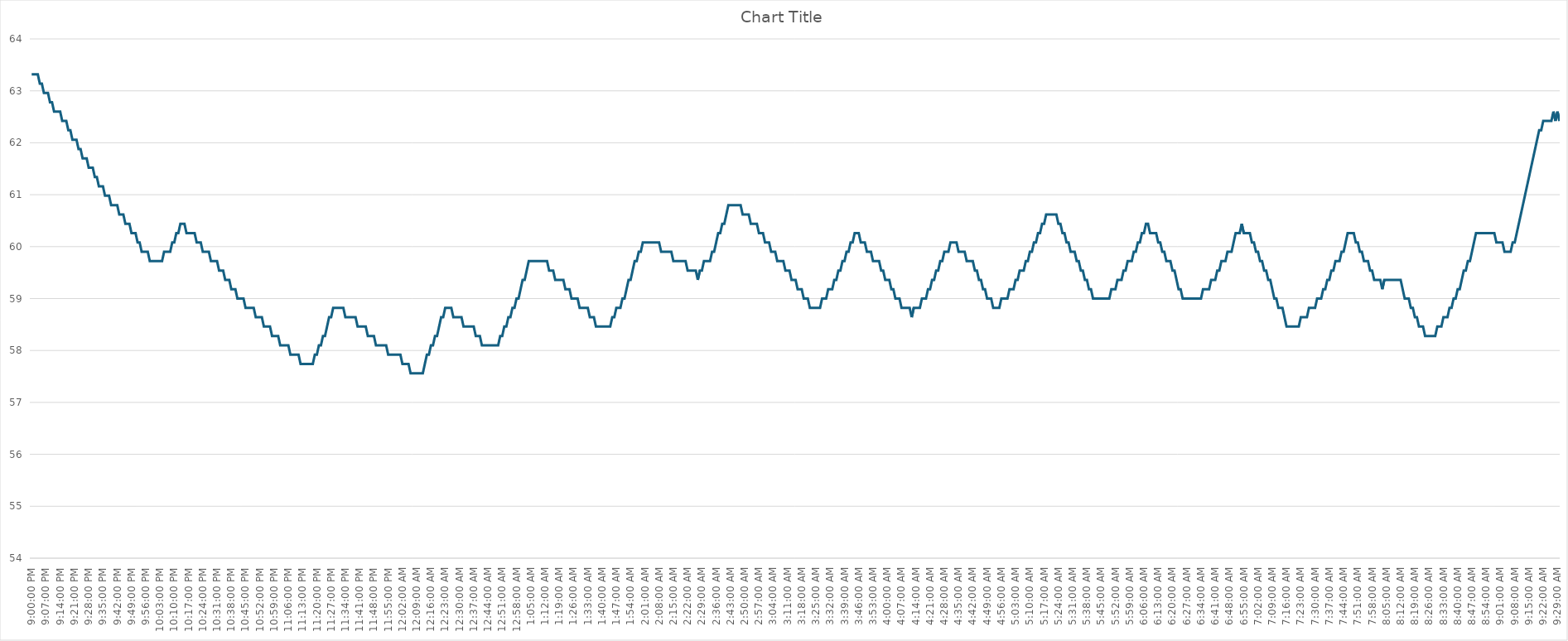
| Category | Series 0 |
|---|---|
| 2024-03-15 21:00:00 | 63.32 |
| 2024-03-15 21:01:00 | 63.32 |
| 2024-03-15 21:02:00 | 63.32 |
| 2024-03-15 21:03:00 | 63.32 |
| 2024-03-15 21:04:00 | 63.14 |
| 2024-03-15 21:05:00 | 63.14 |
| 2024-03-15 21:06:00 | 62.96 |
| 2024-03-15 21:07:00 | 62.96 |
| 2024-03-15 21:08:00 | 62.96 |
| 2024-03-15 21:09:00 | 62.78 |
| 2024-03-15 21:10:00 | 62.78 |
| 2024-03-15 21:11:00 | 62.6 |
| 2024-03-15 21:12:00 | 62.6 |
| 2024-03-15 21:13:00 | 62.6 |
| 2024-03-15 21:14:00 | 62.6 |
| 2024-03-15 21:15:00 | 62.42 |
| 2024-03-15 21:16:00 | 62.42 |
| 2024-03-15 21:17:00 | 62.42 |
| 2024-03-15 21:18:00 | 62.24 |
| 2024-03-15 21:19:00 | 62.24 |
| 2024-03-15 21:20:00 | 62.06 |
| 2024-03-15 21:21:00 | 62.06 |
| 2024-03-15 21:22:00 | 62.06 |
| 2024-03-15 21:23:00 | 61.88 |
| 2024-03-15 21:24:00 | 61.88 |
| 2024-03-15 21:25:00 | 61.7 |
| 2024-03-15 21:26:00 | 61.7 |
| 2024-03-15 21:27:00 | 61.7 |
| 2024-03-15 21:28:00 | 61.52 |
| 2024-03-15 21:29:00 | 61.52 |
| 2024-03-15 21:30:00 | 61.52 |
| 2024-03-15 21:31:00 | 61.34 |
| 2024-03-15 21:32:00 | 61.34 |
| 2024-03-15 21:33:00 | 61.16 |
| 2024-03-15 21:34:00 | 61.16 |
| 2024-03-15 21:35:00 | 61.16 |
| 2024-03-15 21:36:00 | 60.98 |
| 2024-03-15 21:37:00 | 60.98 |
| 2024-03-15 21:38:00 | 60.98 |
| 2024-03-15 21:39:00 | 60.8 |
| 2024-03-15 21:40:00 | 60.8 |
| 2024-03-15 21:41:00 | 60.8 |
| 2024-03-15 21:42:00 | 60.8 |
| 2024-03-15 21:43:00 | 60.62 |
| 2024-03-15 21:44:00 | 60.62 |
| 2024-03-15 21:45:00 | 60.62 |
| 2024-03-15 21:46:00 | 60.44 |
| 2024-03-15 21:47:00 | 60.44 |
| 2024-03-15 21:48:00 | 60.44 |
| 2024-03-15 21:49:00 | 60.26 |
| 2024-03-15 21:50:00 | 60.26 |
| 2024-03-15 21:51:00 | 60.26 |
| 2024-03-15 21:52:00 | 60.08 |
| 2024-03-15 21:53:00 | 60.08 |
| 2024-03-15 21:54:00 | 59.9 |
| 2024-03-15 21:55:00 | 59.9 |
| 2024-03-15 21:56:00 | 59.9 |
| 2024-03-15 21:57:00 | 59.9 |
| 2024-03-15 21:58:00 | 59.72 |
| 2024-03-15 21:59:00 | 59.72 |
| 2024-03-15 22:00:00 | 59.72 |
| 2024-03-15 22:01:00 | 59.72 |
| 2024-03-15 22:02:00 | 59.72 |
| 2024-03-15 22:03:00 | 59.72 |
| 2024-03-15 22:04:00 | 59.72 |
| 2024-03-15 22:05:00 | 59.9 |
| 2024-03-15 22:06:00 | 59.9 |
| 2024-03-15 22:07:00 | 59.9 |
| 2024-03-15 22:08:00 | 59.9 |
| 2024-03-15 22:09:00 | 60.08 |
| 2024-03-15 22:10:00 | 60.08 |
| 2024-03-15 22:11:00 | 60.26 |
| 2024-03-15 22:12:00 | 60.26 |
| 2024-03-15 22:13:00 | 60.44 |
| 2024-03-15 22:14:00 | 60.44 |
| 2024-03-15 22:15:00 | 60.44 |
| 2024-03-15 22:16:00 | 60.26 |
| 2024-03-15 22:17:00 | 60.26 |
| 2024-03-15 22:18:00 | 60.26 |
| 2024-03-15 22:19:00 | 60.26 |
| 2024-03-15 22:20:00 | 60.26 |
| 2024-03-15 22:21:00 | 60.08 |
| 2024-03-15 22:22:00 | 60.08 |
| 2024-03-15 22:23:00 | 60.08 |
| 2024-03-15 22:24:00 | 59.9 |
| 2024-03-15 22:25:00 | 59.9 |
| 2024-03-15 22:26:00 | 59.9 |
| 2024-03-15 22:27:00 | 59.9 |
| 2024-03-15 22:28:00 | 59.72 |
| 2024-03-15 22:29:00 | 59.72 |
| 2024-03-15 22:30:00 | 59.72 |
| 2024-03-15 22:31:00 | 59.72 |
| 2024-03-15 22:32:00 | 59.54 |
| 2024-03-15 22:33:00 | 59.54 |
| 2024-03-15 22:34:00 | 59.54 |
| 2024-03-15 22:35:00 | 59.36 |
| 2024-03-15 22:36:00 | 59.36 |
| 2024-03-15 22:37:00 | 59.36 |
| 2024-03-15 22:38:00 | 59.18 |
| 2024-03-15 22:39:00 | 59.18 |
| 2024-03-15 22:40:00 | 59.18 |
| 2024-03-15 22:41:00 | 59 |
| 2024-03-15 22:42:00 | 59 |
| 2024-03-15 22:43:00 | 59 |
| 2024-03-15 22:44:00 | 59 |
| 2024-03-15 22:45:00 | 58.82 |
| 2024-03-15 22:46:00 | 58.82 |
| 2024-03-15 22:47:00 | 58.82 |
| 2024-03-15 22:48:00 | 58.82 |
| 2024-03-15 22:49:00 | 58.82 |
| 2024-03-15 22:50:00 | 58.64 |
| 2024-03-15 22:51:00 | 58.64 |
| 2024-03-15 22:52:00 | 58.64 |
| 2024-03-15 22:53:00 | 58.64 |
| 2024-03-15 22:54:00 | 58.46 |
| 2024-03-15 22:55:00 | 58.46 |
| 2024-03-15 22:56:00 | 58.46 |
| 2024-03-15 22:57:00 | 58.46 |
| 2024-03-15 22:58:00 | 58.28 |
| 2024-03-15 22:59:00 | 58.28 |
| 2024-03-15 23:00:00 | 58.28 |
| 2024-03-15 23:01:00 | 58.28 |
| 2024-03-15 23:02:00 | 58.1 |
| 2024-03-15 23:03:00 | 58.1 |
| 2024-03-15 23:04:00 | 58.1 |
| 2024-03-15 23:05:00 | 58.1 |
| 2024-03-15 23:06:00 | 58.1 |
| 2024-03-15 23:07:00 | 57.92 |
| 2024-03-15 23:08:00 | 57.92 |
| 2024-03-15 23:09:00 | 57.92 |
| 2024-03-15 23:10:00 | 57.92 |
| 2024-03-15 23:11:00 | 57.92 |
| 2024-03-15 23:12:00 | 57.74 |
| 2024-03-15 23:13:00 | 57.74 |
| 2024-03-15 23:14:00 | 57.74 |
| 2024-03-15 23:15:00 | 57.74 |
| 2024-03-15 23:16:00 | 57.74 |
| 2024-03-15 23:17:00 | 57.74 |
| 2024-03-15 23:18:00 | 57.74 |
| 2024-03-15 23:19:00 | 57.92 |
| 2024-03-15 23:20:00 | 57.92 |
| 2024-03-15 23:21:00 | 58.1 |
| 2024-03-15 23:22:00 | 58.1 |
| 2024-03-15 23:23:00 | 58.28 |
| 2024-03-15 23:24:00 | 58.28 |
| 2024-03-15 23:25:00 | 58.46 |
| 2024-03-15 23:26:00 | 58.64 |
| 2024-03-15 23:27:00 | 58.64 |
| 2024-03-15 23:28:00 | 58.82 |
| 2024-03-15 23:29:00 | 58.82 |
| 2024-03-15 23:30:00 | 58.82 |
| 2024-03-15 23:31:00 | 58.82 |
| 2024-03-15 23:32:00 | 58.82 |
| 2024-03-15 23:33:00 | 58.82 |
| 2024-03-15 23:34:00 | 58.64 |
| 2024-03-15 23:35:00 | 58.64 |
| 2024-03-15 23:36:00 | 58.64 |
| 2024-03-15 23:37:00 | 58.64 |
| 2024-03-15 23:38:00 | 58.64 |
| 2024-03-15 23:39:00 | 58.64 |
| 2024-03-15 23:40:00 | 58.46 |
| 2024-03-15 23:41:00 | 58.46 |
| 2024-03-15 23:42:00 | 58.46 |
| 2024-03-15 23:43:00 | 58.46 |
| 2024-03-15 23:44:00 | 58.46 |
| 2024-03-15 23:45:00 | 58.28 |
| 2024-03-15 23:46:00 | 58.28 |
| 2024-03-15 23:47:00 | 58.28 |
| 2024-03-15 23:48:00 | 58.28 |
| 2024-03-15 23:49:00 | 58.1 |
| 2024-03-15 23:50:00 | 58.1 |
| 2024-03-15 23:51:00 | 58.1 |
| 2024-03-15 23:52:00 | 58.1 |
| 2024-03-15 23:53:00 | 58.1 |
| 2024-03-15 23:54:00 | 58.1 |
| 2024-03-15 23:55:00 | 57.92 |
| 2024-03-15 23:56:00 | 57.92 |
| 2024-03-15 23:57:00 | 57.92 |
| 2024-03-15 23:58:00 | 57.92 |
| 2024-03-15 23:59:00 | 57.92 |
| 2024-03-16 | 57.92 |
| 2024-03-16 00:01:00 | 57.92 |
| 2024-03-16 00:02:00 | 57.74 |
| 2024-03-16 00:03:00 | 57.74 |
| 2024-03-16 00:04:00 | 57.74 |
| 2024-03-16 00:05:00 | 57.74 |
| 2024-03-16 00:06:00 | 57.56 |
| 2024-03-16 00:07:00 | 57.56 |
| 2024-03-16 00:08:00 | 57.56 |
| 2024-03-16 00:09:00 | 57.56 |
| 2024-03-16 00:10:00 | 57.56 |
| 2024-03-16 00:11:00 | 57.56 |
| 2024-03-16 00:12:00 | 57.56 |
| 2024-03-16 00:13:00 | 57.74 |
| 2024-03-16 00:14:00 | 57.92 |
| 2024-03-16 00:15:00 | 57.92 |
| 2024-03-16 00:16:00 | 58.1 |
| 2024-03-16 00:17:00 | 58.1 |
| 2024-03-16 00:18:00 | 58.28 |
| 2024-03-16 00:19:00 | 58.28 |
| 2024-03-16 00:20:00 | 58.46 |
| 2024-03-16 00:21:00 | 58.64 |
| 2024-03-16 00:22:00 | 58.64 |
| 2024-03-16 00:23:00 | 58.82 |
| 2024-03-16 00:24:00 | 58.82 |
| 2024-03-16 00:25:00 | 58.82 |
| 2024-03-16 00:26:00 | 58.82 |
| 2024-03-16 00:27:00 | 58.64 |
| 2024-03-16 00:28:00 | 58.64 |
| 2024-03-16 00:29:00 | 58.64 |
| 2024-03-16 00:30:00 | 58.64 |
| 2024-03-16 00:31:00 | 58.64 |
| 2024-03-16 00:32:00 | 58.46 |
| 2024-03-16 00:33:00 | 58.46 |
| 2024-03-16 00:34:00 | 58.46 |
| 2024-03-16 00:35:00 | 58.46 |
| 2024-03-16 00:36:00 | 58.46 |
| 2024-03-16 00:37:00 | 58.46 |
| 2024-03-16 00:38:00 | 58.28 |
| 2024-03-16 00:39:00 | 58.28 |
| 2024-03-16 00:40:00 | 58.28 |
| 2024-03-16 00:41:00 | 58.1 |
| 2024-03-16 00:42:00 | 58.1 |
| 2024-03-16 00:43:00 | 58.1 |
| 2024-03-16 00:44:00 | 58.1 |
| 2024-03-16 00:45:00 | 58.1 |
| 2024-03-16 00:46:00 | 58.1 |
| 2024-03-16 00:47:00 | 58.1 |
| 2024-03-16 00:48:00 | 58.1 |
| 2024-03-16 00:49:00 | 58.1 |
| 2024-03-16 00:50:00 | 58.28 |
| 2024-03-16 00:51:00 | 58.28 |
| 2024-03-16 00:52:00 | 58.46 |
| 2024-03-16 00:53:00 | 58.46 |
| 2024-03-16 00:54:00 | 58.64 |
| 2024-03-16 00:55:00 | 58.64 |
| 2024-03-16 00:56:00 | 58.82 |
| 2024-03-16 00:57:00 | 58.82 |
| 2024-03-16 00:58:00 | 59 |
| 2024-03-16 00:59:00 | 59 |
| 2024-03-16 01:00:00 | 59.18 |
| 2024-03-16 01:01:00 | 59.36 |
| 2024-03-16 01:02:00 | 59.36 |
| 2024-03-16 01:03:00 | 59.54 |
| 2024-03-16 01:04:00 | 59.72 |
| 2024-03-16 01:05:00 | 59.72 |
| 2024-03-16 01:06:00 | 59.72 |
| 2024-03-16 01:07:00 | 59.72 |
| 2024-03-16 01:08:00 | 59.72 |
| 2024-03-16 01:09:00 | 59.72 |
| 2024-03-16 01:10:00 | 59.72 |
| 2024-03-16 01:11:00 | 59.72 |
| 2024-03-16 01:12:00 | 59.72 |
| 2024-03-16 01:13:00 | 59.72 |
| 2024-03-16 01:14:00 | 59.54 |
| 2024-03-16 01:15:00 | 59.54 |
| 2024-03-16 01:16:00 | 59.54 |
| 2024-03-16 01:17:00 | 59.36 |
| 2024-03-16 01:18:00 | 59.36 |
| 2024-03-16 01:19:00 | 59.36 |
| 2024-03-16 01:20:00 | 59.36 |
| 2024-03-16 01:21:00 | 59.36 |
| 2024-03-16 01:22:00 | 59.18 |
| 2024-03-16 01:23:00 | 59.18 |
| 2024-03-16 01:24:00 | 59.18 |
| 2024-03-16 01:25:00 | 59 |
| 2024-03-16 01:26:00 | 59 |
| 2024-03-16 01:27:00 | 59 |
| 2024-03-16 01:28:00 | 59 |
| 2024-03-16 01:29:00 | 58.82 |
| 2024-03-16 01:30:00 | 58.82 |
| 2024-03-16 01:31:00 | 58.82 |
| 2024-03-16 01:32:00 | 58.82 |
| 2024-03-16 01:33:00 | 58.82 |
| 2024-03-16 01:34:00 | 58.64 |
| 2024-03-16 01:35:00 | 58.64 |
| 2024-03-16 01:36:00 | 58.64 |
| 2024-03-16 01:37:00 | 58.46 |
| 2024-03-16 01:38:00 | 58.46 |
| 2024-03-16 01:39:00 | 58.46 |
| 2024-03-16 01:40:00 | 58.46 |
| 2024-03-16 01:41:00 | 58.46 |
| 2024-03-16 01:42:00 | 58.46 |
| 2024-03-16 01:43:00 | 58.46 |
| 2024-03-16 01:44:00 | 58.46 |
| 2024-03-16 01:45:00 | 58.64 |
| 2024-03-16 01:46:00 | 58.64 |
| 2024-03-16 01:47:00 | 58.82 |
| 2024-03-16 01:48:00 | 58.82 |
| 2024-03-16 01:49:00 | 58.82 |
| 2024-03-16 01:50:00 | 59 |
| 2024-03-16 01:51:00 | 59 |
| 2024-03-16 01:52:00 | 59.18 |
| 2024-03-16 01:53:00 | 59.36 |
| 2024-03-16 01:54:00 | 59.36 |
| 2024-03-16 01:55:00 | 59.54 |
| 2024-03-16 01:56:00 | 59.72 |
| 2024-03-16 01:57:00 | 59.72 |
| 2024-03-16 01:58:00 | 59.9 |
| 2024-03-16 01:59:00 | 59.9 |
| 2024-03-16 02:00:00 | 60.08 |
| 2024-03-16 02:01:00 | 60.08 |
| 2024-03-16 02:02:00 | 60.08 |
| 2024-03-16 02:03:00 | 60.08 |
| 2024-03-16 02:04:00 | 60.08 |
| 2024-03-16 02:05:00 | 60.08 |
| 2024-03-16 02:06:00 | 60.08 |
| 2024-03-16 02:07:00 | 60.08 |
| 2024-03-16 02:08:00 | 60.08 |
| 2024-03-16 02:09:00 | 59.9 |
| 2024-03-16 02:10:00 | 59.9 |
| 2024-03-16 02:11:00 | 59.9 |
| 2024-03-16 02:12:00 | 59.9 |
| 2024-03-16 02:13:00 | 59.9 |
| 2024-03-16 02:14:00 | 59.9 |
| 2024-03-16 02:15:00 | 59.72 |
| 2024-03-16 02:16:00 | 59.72 |
| 2024-03-16 02:17:00 | 59.72 |
| 2024-03-16 02:18:00 | 59.72 |
| 2024-03-16 02:19:00 | 59.72 |
| 2024-03-16 02:20:00 | 59.72 |
| 2024-03-16 02:21:00 | 59.72 |
| 2024-03-16 02:22:00 | 59.54 |
| 2024-03-16 02:23:00 | 59.54 |
| 2024-03-16 02:24:00 | 59.54 |
| 2024-03-16 02:25:00 | 59.54 |
| 2024-03-16 02:26:00 | 59.54 |
| 2024-03-16 02:27:00 | 59.36 |
| 2024-03-16 02:28:00 | 59.54 |
| 2024-03-16 02:29:00 | 59.54 |
| 2024-03-16 02:30:00 | 59.72 |
| 2024-03-16 02:31:00 | 59.72 |
| 2024-03-16 02:32:00 | 59.72 |
| 2024-03-16 02:33:00 | 59.72 |
| 2024-03-16 02:34:00 | 59.9 |
| 2024-03-16 02:35:00 | 59.9 |
| 2024-03-16 02:36:00 | 60.08 |
| 2024-03-16 02:37:00 | 60.26 |
| 2024-03-16 02:38:00 | 60.26 |
| 2024-03-16 02:39:00 | 60.44 |
| 2024-03-16 02:40:00 | 60.44 |
| 2024-03-16 02:41:00 | 60.62 |
| 2024-03-16 02:42:00 | 60.8 |
| 2024-03-16 02:43:00 | 60.8 |
| 2024-03-16 02:44:00 | 60.8 |
| 2024-03-16 02:45:00 | 60.8 |
| 2024-03-16 02:46:00 | 60.8 |
| 2024-03-16 02:47:00 | 60.8 |
| 2024-03-16 02:48:00 | 60.8 |
| 2024-03-16 02:49:00 | 60.62 |
| 2024-03-16 02:50:00 | 60.62 |
| 2024-03-16 02:51:00 | 60.62 |
| 2024-03-16 02:52:00 | 60.62 |
| 2024-03-16 02:53:00 | 60.44 |
| 2024-03-16 02:54:00 | 60.44 |
| 2024-03-16 02:55:00 | 60.44 |
| 2024-03-16 02:56:00 | 60.44 |
| 2024-03-16 02:57:00 | 60.26 |
| 2024-03-16 02:58:00 | 60.26 |
| 2024-03-16 02:59:00 | 60.26 |
| 2024-03-16 03:00:00 | 60.08 |
| 2024-03-16 03:01:00 | 60.08 |
| 2024-03-16 03:02:00 | 60.08 |
| 2024-03-16 03:03:00 | 59.9 |
| 2024-03-16 03:04:00 | 59.9 |
| 2024-03-16 03:05:00 | 59.9 |
| 2024-03-16 03:06:00 | 59.72 |
| 2024-03-16 03:07:00 | 59.72 |
| 2024-03-16 03:08:00 | 59.72 |
| 2024-03-16 03:09:00 | 59.72 |
| 2024-03-16 03:10:00 | 59.54 |
| 2024-03-16 03:11:00 | 59.54 |
| 2024-03-16 03:12:00 | 59.54 |
| 2024-03-16 03:13:00 | 59.36 |
| 2024-03-16 03:14:00 | 59.36 |
| 2024-03-16 03:15:00 | 59.36 |
| 2024-03-16 03:16:00 | 59.18 |
| 2024-03-16 03:17:00 | 59.18 |
| 2024-03-16 03:18:00 | 59.18 |
| 2024-03-16 03:19:00 | 59 |
| 2024-03-16 03:20:00 | 59 |
| 2024-03-16 03:21:00 | 59 |
| 2024-03-16 03:22:00 | 58.82 |
| 2024-03-16 03:23:00 | 58.82 |
| 2024-03-16 03:24:00 | 58.82 |
| 2024-03-16 03:25:00 | 58.82 |
| 2024-03-16 03:26:00 | 58.82 |
| 2024-03-16 03:27:00 | 58.82 |
| 2024-03-16 03:28:00 | 59 |
| 2024-03-16 03:29:00 | 59 |
| 2024-03-16 03:30:00 | 59 |
| 2024-03-16 03:31:00 | 59.18 |
| 2024-03-16 03:32:00 | 59.18 |
| 2024-03-16 03:33:00 | 59.18 |
| 2024-03-16 03:34:00 | 59.36 |
| 2024-03-16 03:35:00 | 59.36 |
| 2024-03-16 03:36:00 | 59.54 |
| 2024-03-16 03:37:00 | 59.54 |
| 2024-03-16 03:38:00 | 59.72 |
| 2024-03-16 03:39:00 | 59.72 |
| 2024-03-16 03:40:00 | 59.9 |
| 2024-03-16 03:41:00 | 59.9 |
| 2024-03-16 03:42:00 | 60.08 |
| 2024-03-16 03:43:00 | 60.08 |
| 2024-03-16 03:44:00 | 60.26 |
| 2024-03-16 03:45:00 | 60.26 |
| 2024-03-16 03:46:00 | 60.26 |
| 2024-03-16 03:47:00 | 60.08 |
| 2024-03-16 03:48:00 | 60.08 |
| 2024-03-16 03:49:00 | 60.08 |
| 2024-03-16 03:50:00 | 59.9 |
| 2024-03-16 03:51:00 | 59.9 |
| 2024-03-16 03:52:00 | 59.9 |
| 2024-03-16 03:53:00 | 59.72 |
| 2024-03-16 03:54:00 | 59.72 |
| 2024-03-16 03:55:00 | 59.72 |
| 2024-03-16 03:56:00 | 59.72 |
| 2024-03-16 03:57:00 | 59.54 |
| 2024-03-16 03:58:00 | 59.54 |
| 2024-03-16 03:59:00 | 59.36 |
| 2024-03-16 04:00:00 | 59.36 |
| 2024-03-16 04:01:00 | 59.36 |
| 2024-03-16 04:02:00 | 59.18 |
| 2024-03-16 04:03:00 | 59.18 |
| 2024-03-16 04:04:00 | 59 |
| 2024-03-16 04:05:00 | 59 |
| 2024-03-16 04:06:00 | 59 |
| 2024-03-16 04:07:00 | 58.82 |
| 2024-03-16 04:08:00 | 58.82 |
| 2024-03-16 04:09:00 | 58.82 |
| 2024-03-16 04:10:00 | 58.82 |
| 2024-03-16 04:11:00 | 58.82 |
| 2024-03-16 04:12:00 | 58.64 |
| 2024-03-16 04:13:00 | 58.82 |
| 2024-03-16 04:14:00 | 58.82 |
| 2024-03-16 04:15:00 | 58.82 |
| 2024-03-16 04:16:00 | 58.82 |
| 2024-03-16 04:17:00 | 59 |
| 2024-03-16 04:18:00 | 59 |
| 2024-03-16 04:19:00 | 59 |
| 2024-03-16 04:20:00 | 59.18 |
| 2024-03-16 04:21:00 | 59.18 |
| 2024-03-16 04:22:00 | 59.36 |
| 2024-03-16 04:23:00 | 59.36 |
| 2024-03-16 04:24:00 | 59.54 |
| 2024-03-16 04:25:00 | 59.54 |
| 2024-03-16 04:26:00 | 59.72 |
| 2024-03-16 04:27:00 | 59.72 |
| 2024-03-16 04:28:00 | 59.9 |
| 2024-03-16 04:29:00 | 59.9 |
| 2024-03-16 04:30:00 | 59.9 |
| 2024-03-16 04:31:00 | 60.08 |
| 2024-03-16 04:32:00 | 60.08 |
| 2024-03-16 04:33:00 | 60.08 |
| 2024-03-16 04:34:00 | 60.08 |
| 2024-03-16 04:35:00 | 59.9 |
| 2024-03-16 04:36:00 | 59.9 |
| 2024-03-16 04:37:00 | 59.9 |
| 2024-03-16 04:38:00 | 59.9 |
| 2024-03-16 04:39:00 | 59.72 |
| 2024-03-16 04:40:00 | 59.72 |
| 2024-03-16 04:41:00 | 59.72 |
| 2024-03-16 04:42:00 | 59.72 |
| 2024-03-16 04:43:00 | 59.54 |
| 2024-03-16 04:44:00 | 59.54 |
| 2024-03-16 04:45:00 | 59.36 |
| 2024-03-16 04:46:00 | 59.36 |
| 2024-03-16 04:47:00 | 59.18 |
| 2024-03-16 04:48:00 | 59.18 |
| 2024-03-16 04:49:00 | 59 |
| 2024-03-16 04:50:00 | 59 |
| 2024-03-16 04:51:00 | 59 |
| 2024-03-16 04:52:00 | 58.82 |
| 2024-03-16 04:53:00 | 58.82 |
| 2024-03-16 04:54:00 | 58.82 |
| 2024-03-16 04:55:00 | 58.82 |
| 2024-03-16 04:56:00 | 59 |
| 2024-03-16 04:57:00 | 59 |
| 2024-03-16 04:58:00 | 59 |
| 2024-03-16 04:59:00 | 59 |
| 2024-03-16 05:00:00 | 59.18 |
| 2024-03-16 05:01:00 | 59.18 |
| 2024-03-16 05:02:00 | 59.18 |
| 2024-03-16 05:03:00 | 59.36 |
| 2024-03-16 05:04:00 | 59.36 |
| 2024-03-16 05:05:00 | 59.54 |
| 2024-03-16 05:06:00 | 59.54 |
| 2024-03-16 05:07:00 | 59.54 |
| 2024-03-16 05:08:00 | 59.72 |
| 2024-03-16 05:09:00 | 59.72 |
| 2024-03-16 05:10:00 | 59.9 |
| 2024-03-16 05:11:00 | 59.9 |
| 2024-03-16 05:12:00 | 60.08 |
| 2024-03-16 05:13:00 | 60.08 |
| 2024-03-16 05:14:00 | 60.26 |
| 2024-03-16 05:15:00 | 60.26 |
| 2024-03-16 05:16:00 | 60.44 |
| 2024-03-16 05:17:00 | 60.44 |
| 2024-03-16 05:18:00 | 60.62 |
| 2024-03-16 05:19:00 | 60.62 |
| 2024-03-16 05:20:00 | 60.62 |
| 2024-03-16 05:21:00 | 60.62 |
| 2024-03-16 05:22:00 | 60.62 |
| 2024-03-16 05:23:00 | 60.62 |
| 2024-03-16 05:24:00 | 60.44 |
| 2024-03-16 05:25:00 | 60.44 |
| 2024-03-16 05:26:00 | 60.26 |
| 2024-03-16 05:27:00 | 60.26 |
| 2024-03-16 05:28:00 | 60.08 |
| 2024-03-16 05:29:00 | 60.08 |
| 2024-03-16 05:30:00 | 59.9 |
| 2024-03-16 05:31:00 | 59.9 |
| 2024-03-16 05:32:00 | 59.9 |
| 2024-03-16 05:33:00 | 59.72 |
| 2024-03-16 05:34:00 | 59.72 |
| 2024-03-16 05:35:00 | 59.54 |
| 2024-03-16 05:36:00 | 59.54 |
| 2024-03-16 05:37:00 | 59.36 |
| 2024-03-16 05:38:00 | 59.36 |
| 2024-03-16 05:39:00 | 59.18 |
| 2024-03-16 05:40:00 | 59.18 |
| 2024-03-16 05:41:00 | 59 |
| 2024-03-16 05:42:00 | 59 |
| 2024-03-16 05:43:00 | 59 |
| 2024-03-16 05:44:00 | 59 |
| 2024-03-16 05:45:00 | 59 |
| 2024-03-16 05:46:00 | 59 |
| 2024-03-16 05:47:00 | 59 |
| 2024-03-16 05:48:00 | 59 |
| 2024-03-16 05:49:00 | 59 |
| 2024-03-16 05:50:00 | 59.18 |
| 2024-03-16 05:51:00 | 59.18 |
| 2024-03-16 05:52:00 | 59.18 |
| 2024-03-16 05:53:00 | 59.36 |
| 2024-03-16 05:54:00 | 59.36 |
| 2024-03-16 05:55:00 | 59.36 |
| 2024-03-16 05:56:00 | 59.54 |
| 2024-03-16 05:57:00 | 59.54 |
| 2024-03-16 05:58:00 | 59.72 |
| 2024-03-16 05:59:00 | 59.72 |
| 2024-03-16 06:00:00 | 59.72 |
| 2024-03-16 06:01:00 | 59.9 |
| 2024-03-16 06:02:00 | 59.9 |
| 2024-03-16 06:03:00 | 60.08 |
| 2024-03-16 06:04:00 | 60.08 |
| 2024-03-16 06:05:00 | 60.26 |
| 2024-03-16 06:06:00 | 60.26 |
| 2024-03-16 06:07:00 | 60.44 |
| 2024-03-16 06:08:00 | 60.44 |
| 2024-03-16 06:09:00 | 60.26 |
| 2024-03-16 06:10:00 | 60.26 |
| 2024-03-16 06:11:00 | 60.26 |
| 2024-03-16 06:12:00 | 60.26 |
| 2024-03-16 06:13:00 | 60.08 |
| 2024-03-16 06:14:00 | 60.08 |
| 2024-03-16 06:15:00 | 59.9 |
| 2024-03-16 06:16:00 | 59.9 |
| 2024-03-16 06:17:00 | 59.72 |
| 2024-03-16 06:18:00 | 59.72 |
| 2024-03-16 06:19:00 | 59.72 |
| 2024-03-16 06:20:00 | 59.54 |
| 2024-03-16 06:21:00 | 59.54 |
| 2024-03-16 06:22:00 | 59.36 |
| 2024-03-16 06:23:00 | 59.18 |
| 2024-03-16 06:24:00 | 59.18 |
| 2024-03-16 06:25:00 | 59 |
| 2024-03-16 06:26:00 | 59 |
| 2024-03-16 06:27:00 | 59 |
| 2024-03-16 06:28:00 | 59 |
| 2024-03-16 06:29:00 | 59 |
| 2024-03-16 06:30:00 | 59 |
| 2024-03-16 06:31:00 | 59 |
| 2024-03-16 06:32:00 | 59 |
| 2024-03-16 06:33:00 | 59 |
| 2024-03-16 06:34:00 | 59 |
| 2024-03-16 06:35:00 | 59.18 |
| 2024-03-16 06:36:00 | 59.18 |
| 2024-03-16 06:37:00 | 59.18 |
| 2024-03-16 06:38:00 | 59.18 |
| 2024-03-16 06:39:00 | 59.36 |
| 2024-03-16 06:40:00 | 59.36 |
| 2024-03-16 06:41:00 | 59.36 |
| 2024-03-16 06:42:00 | 59.54 |
| 2024-03-16 06:43:00 | 59.54 |
| 2024-03-16 06:44:00 | 59.72 |
| 2024-03-16 06:45:00 | 59.72 |
| 2024-03-16 06:46:00 | 59.72 |
| 2024-03-16 06:47:00 | 59.9 |
| 2024-03-16 06:48:00 | 59.9 |
| 2024-03-16 06:49:00 | 59.9 |
| 2024-03-16 06:50:00 | 60.08 |
| 2024-03-16 06:51:00 | 60.26 |
| 2024-03-16 06:52:00 | 60.26 |
| 2024-03-16 06:53:00 | 60.26 |
| 2024-03-16 06:54:00 | 60.44 |
| 2024-03-16 06:55:00 | 60.26 |
| 2024-03-16 06:56:00 | 60.26 |
| 2024-03-16 06:57:00 | 60.26 |
| 2024-03-16 06:58:00 | 60.26 |
| 2024-03-16 06:59:00 | 60.08 |
| 2024-03-16 07:00:00 | 60.08 |
| 2024-03-16 07:01:00 | 59.9 |
| 2024-03-16 07:02:00 | 59.9 |
| 2024-03-16 07:03:00 | 59.72 |
| 2024-03-16 07:04:00 | 59.72 |
| 2024-03-16 07:05:00 | 59.54 |
| 2024-03-16 07:06:00 | 59.54 |
| 2024-03-16 07:07:00 | 59.36 |
| 2024-03-16 07:08:00 | 59.36 |
| 2024-03-16 07:09:00 | 59.18 |
| 2024-03-16 07:10:00 | 59 |
| 2024-03-16 07:11:00 | 59 |
| 2024-03-16 07:12:00 | 58.82 |
| 2024-03-16 07:13:00 | 58.82 |
| 2024-03-16 07:14:00 | 58.82 |
| 2024-03-16 07:15:00 | 58.64 |
| 2024-03-16 07:16:00 | 58.46 |
| 2024-03-16 07:17:00 | 58.46 |
| 2024-03-16 07:18:00 | 58.46 |
| 2024-03-16 07:19:00 | 58.46 |
| 2024-03-16 07:20:00 | 58.46 |
| 2024-03-16 07:21:00 | 58.46 |
| 2024-03-16 07:22:00 | 58.46 |
| 2024-03-16 07:23:00 | 58.64 |
| 2024-03-16 07:24:00 | 58.64 |
| 2024-03-16 07:25:00 | 58.64 |
| 2024-03-16 07:26:00 | 58.64 |
| 2024-03-16 07:27:00 | 58.82 |
| 2024-03-16 07:28:00 | 58.82 |
| 2024-03-16 07:29:00 | 58.82 |
| 2024-03-16 07:30:00 | 58.82 |
| 2024-03-16 07:31:00 | 59 |
| 2024-03-16 07:32:00 | 59 |
| 2024-03-16 07:33:00 | 59 |
| 2024-03-16 07:34:00 | 59.18 |
| 2024-03-16 07:35:00 | 59.18 |
| 2024-03-16 07:36:00 | 59.36 |
| 2024-03-16 07:37:00 | 59.36 |
| 2024-03-16 07:38:00 | 59.54 |
| 2024-03-16 07:39:00 | 59.54 |
| 2024-03-16 07:40:00 | 59.72 |
| 2024-03-16 07:41:00 | 59.72 |
| 2024-03-16 07:42:00 | 59.72 |
| 2024-03-16 07:43:00 | 59.9 |
| 2024-03-16 07:44:00 | 59.9 |
| 2024-03-16 07:45:00 | 60.08 |
| 2024-03-16 07:46:00 | 60.26 |
| 2024-03-16 07:47:00 | 60.26 |
| 2024-03-16 07:48:00 | 60.26 |
| 2024-03-16 07:49:00 | 60.26 |
| 2024-03-16 07:50:00 | 60.08 |
| 2024-03-16 07:51:00 | 60.08 |
| 2024-03-16 07:52:00 | 59.9 |
| 2024-03-16 07:53:00 | 59.9 |
| 2024-03-16 07:54:00 | 59.72 |
| 2024-03-16 07:55:00 | 59.72 |
| 2024-03-16 07:56:00 | 59.72 |
| 2024-03-16 07:57:00 | 59.54 |
| 2024-03-16 07:58:00 | 59.54 |
| 2024-03-16 07:59:00 | 59.36 |
| 2024-03-16 08:00:00 | 59.36 |
| 2024-03-16 08:01:00 | 59.36 |
| 2024-03-16 08:02:00 | 59.36 |
| 2024-03-16 08:03:00 | 59.18 |
| 2024-03-16 08:04:00 | 59.36 |
| 2024-03-16 08:05:00 | 59.36 |
| 2024-03-16 08:06:00 | 59.36 |
| 2024-03-16 08:07:00 | 59.36 |
| 2024-03-16 08:08:00 | 59.36 |
| 2024-03-16 08:09:00 | 59.36 |
| 2024-03-16 08:10:00 | 59.36 |
| 2024-03-16 08:11:00 | 59.36 |
| 2024-03-16 08:12:00 | 59.36 |
| 2024-03-16 08:13:00 | 59.18 |
| 2024-03-16 08:14:00 | 59 |
| 2024-03-16 08:15:00 | 59 |
| 2024-03-16 08:16:00 | 59 |
| 2024-03-16 08:17:00 | 58.82 |
| 2024-03-16 08:18:00 | 58.82 |
| 2024-03-16 08:19:00 | 58.64 |
| 2024-03-16 08:20:00 | 58.64 |
| 2024-03-16 08:21:00 | 58.46 |
| 2024-03-16 08:22:00 | 58.46 |
| 2024-03-16 08:23:00 | 58.46 |
| 2024-03-16 08:24:00 | 58.28 |
| 2024-03-16 08:25:00 | 58.28 |
| 2024-03-16 08:26:00 | 58.28 |
| 2024-03-16 08:27:00 | 58.28 |
| 2024-03-16 08:28:00 | 58.28 |
| 2024-03-16 08:29:00 | 58.28 |
| 2024-03-16 08:30:00 | 58.46 |
| 2024-03-16 08:31:00 | 58.46 |
| 2024-03-16 08:32:00 | 58.46 |
| 2024-03-16 08:33:00 | 58.64 |
| 2024-03-16 08:34:00 | 58.64 |
| 2024-03-16 08:35:00 | 58.64 |
| 2024-03-16 08:36:00 | 58.82 |
| 2024-03-16 08:37:00 | 58.82 |
| 2024-03-16 08:38:00 | 59 |
| 2024-03-16 08:39:00 | 59 |
| 2024-03-16 08:40:00 | 59.18 |
| 2024-03-16 08:41:00 | 59.18 |
| 2024-03-16 08:42:00 | 59.36 |
| 2024-03-16 08:43:00 | 59.54 |
| 2024-03-16 08:44:00 | 59.54 |
| 2024-03-16 08:45:00 | 59.72 |
| 2024-03-16 08:46:00 | 59.72 |
| 2024-03-16 08:47:00 | 59.9 |
| 2024-03-16 08:48:00 | 60.08 |
| 2024-03-16 08:49:00 | 60.26 |
| 2024-03-16 08:50:00 | 60.26 |
| 2024-03-16 08:51:00 | 60.26 |
| 2024-03-16 08:52:00 | 60.26 |
| 2024-03-16 08:53:00 | 60.26 |
| 2024-03-16 08:54:00 | 60.26 |
| 2024-03-16 08:55:00 | 60.26 |
| 2024-03-16 08:56:00 | 60.26 |
| 2024-03-16 08:57:00 | 60.26 |
| 2024-03-16 08:58:00 | 60.26 |
| 2024-03-16 08:59:00 | 60.08 |
| 2024-03-16 09:00:00 | 60.08 |
| 2024-03-16 09:01:00 | 60.08 |
| 2024-03-16 09:02:00 | 60.08 |
| 2024-03-16 09:03:00 | 59.9 |
| 2024-03-16 09:04:00 | 59.9 |
| 2024-03-16 09:05:00 | 59.9 |
| 2024-03-16 09:06:00 | 59.9 |
| 2024-03-16 09:07:00 | 60.08 |
| 2024-03-16 09:08:00 | 60.08 |
| 2024-03-16 09:09:00 | 60.26 |
| 2024-03-16 09:10:00 | 60.44 |
| 2024-03-16 09:11:00 | 60.62 |
| 2024-03-16 09:12:00 | 60.8 |
| 2024-03-16 09:13:00 | 60.98 |
| 2024-03-16 09:14:00 | 61.16 |
| 2024-03-16 09:15:00 | 61.34 |
| 2024-03-16 09:16:00 | 61.52 |
| 2024-03-16 09:17:00 | 61.7 |
| 2024-03-16 09:18:00 | 61.88 |
| 2024-03-16 09:19:00 | 62.06 |
| 2024-03-16 09:20:00 | 62.24 |
| 2024-03-16 09:21:00 | 62.24 |
| 2024-03-16 09:22:00 | 62.42 |
| 2024-03-16 09:23:00 | 62.42 |
| 2024-03-16 09:24:00 | 62.42 |
| 2024-03-16 09:25:00 | 62.42 |
| 2024-03-16 09:26:00 | 62.42 |
| 2024-03-16 09:27:00 | 62.6 |
| 2024-03-16 09:28:00 | 62.42 |
| 2024-03-16 09:29:00 | 62.6 |
| 2024-03-16 09:30:00 | 62.42 |